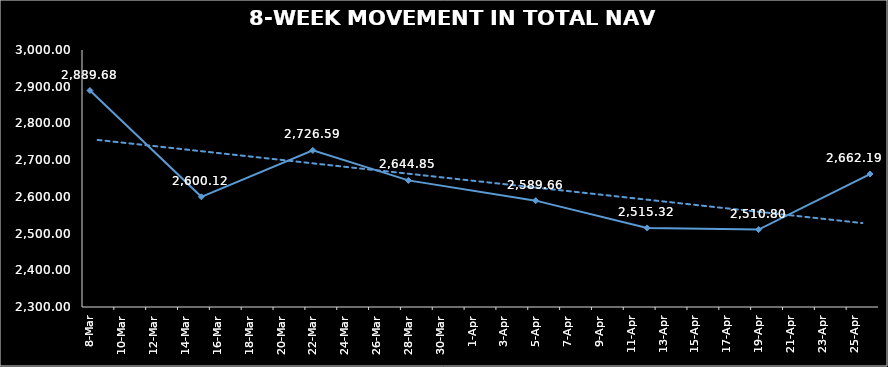
| Category | TOTAL NAV |
|---|---|
| 2024-03-08 | 2889.675 |
| 2024-03-15 | 2600.12 |
| 2024-03-22 | 2726.59 |
| 2024-03-28 | 2644.848 |
| 2024-04-05 | 2589.664 |
| 2024-04-12 | 2515.322 |
| 2024-04-19 | 2510.798 |
| 2024-04-26 | 2662.194 |